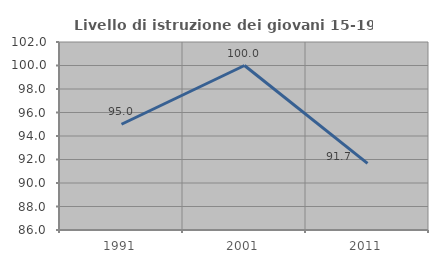
| Category | Livello di istruzione dei giovani 15-19 anni |
|---|---|
| 1991.0 | 95 |
| 2001.0 | 100 |
| 2011.0 | 91.667 |